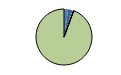
| Category | Series 0 |
|---|---|
| ARRASTRE | 72 |
| CERCO | 57 |
| ATUNEROS CAÑEROS | 16 |
| PALANGRE DE FONDO | 16 |
| PALANGRE DE SUPERFICIE | 1 |
| RASCO | 1 |
| VOLANTA | 1 |
| ARTES FIJAS | 2 |
| ARTES MENORES | 2776 |